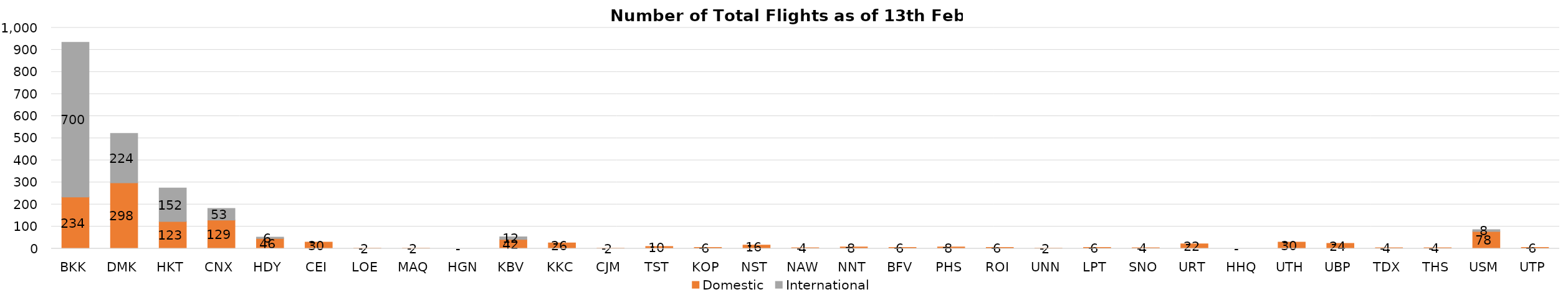
| Category | Domestic | International |
|---|---|---|
| BKK | 234 | 700 |
| DMK | 298 | 224 |
| HKT | 123 | 152 |
| CNX | 129 | 53 |
| HDY | 46 | 6 |
| CEI | 30 | 0 |
| LOE | 2 | 0 |
| MAQ | 2 | 0 |
| HGN | 0 | 0 |
| KBV | 42 | 12 |
| KKC | 26 | 0 |
| CJM | 2 | 0 |
| TST | 10 | 0 |
| KOP | 6 | 0 |
| NST | 16 | 0 |
| NAW | 4 | 0 |
| NNT | 8 | 0 |
| BFV | 6 | 0 |
| PHS | 8 | 0 |
| ROI | 6 | 0 |
| UNN | 2 | 0 |
| LPT | 6 | 0 |
| SNO | 4 | 0 |
| URT | 22 | 0 |
| HHQ | 0 | 0 |
| UTH | 30 | 0 |
| UBP | 24 | 0 |
| TDX | 4 | 0 |
| THS | 4 | 0 |
| USM | 78 | 8 |
| UTP | 6 | 0 |